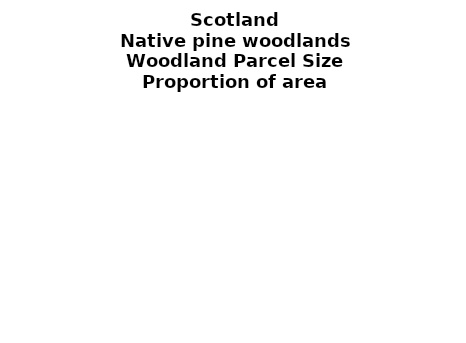
| Category | Native pine woodlands |
|---|---|
| <5 ha | 0.028 |
| ≥5 and <10 ha | 0.02 |
| ≥10 and <15 ha | 0.016 |
| ≥15 and <20 ha | 0.014 |
| ≥20 and <25 ha | 0.019 |
| ≥25 and <30 ha | 0.013 |
| ≥30 and <35 ha | 0.005 |
| ≥35 and <40 ha | 0.008 |
| ≥40 and <45 ha | 0.01 |
| ≥45 and <50 ha | 0.01 |
| ≥50 and <60 ha | 0.014 |
| ≥60 and <70 ha | 0.014 |
| ≥70 and <80 ha | 0.003 |
| ≥80 and <90 ha | 0.015 |
| ≥90 and <100 ha | 0.003 |
| ≥100 and <150 ha | 0.04 |
| ≥150 and <200 ha | 0.032 |
| ≥200 ha | 0.737 |